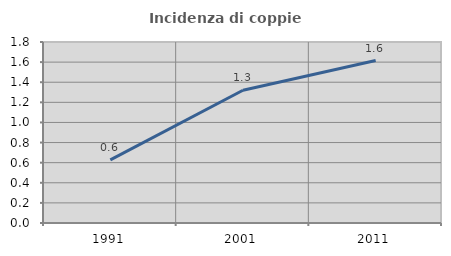
| Category | Incidenza di coppie miste |
|---|---|
| 1991.0 | 0.627 |
| 2001.0 | 1.32 |
| 2011.0 | 1.616 |